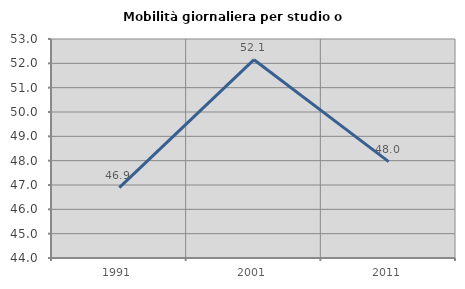
| Category | Mobilità giornaliera per studio o lavoro |
|---|---|
| 1991.0 | 46.894 |
| 2001.0 | 52.149 |
| 2011.0 | 47.96 |